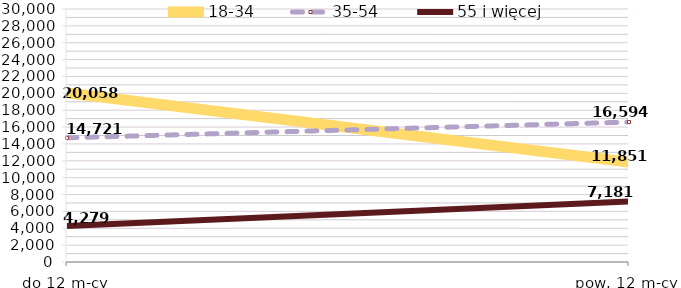
| Category | 18-34 | 35-54 | 55 i więcej |
|---|---|---|---|
| do 12 m-cy | 20058 | 14721 | 4279 |
| pow. 12 m-cy | 11851 | 16594 | 7181 |